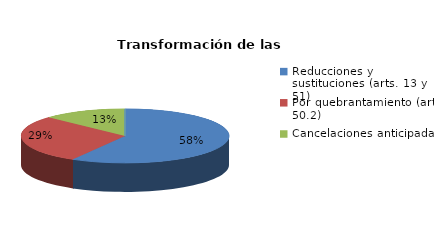
| Category | Series 0 |
|---|---|
| Reducciones y sustituciones (arts. 13 y 51) | 63 |
| Por quebrantamiento (art. 50.2) | 31 |
| Cancelaciones anticipadas | 14 |
| Traslado a Centros Penitenciarios | 0 |
| Conversión internamientos en cerrados (art. 51.2) | 0 |